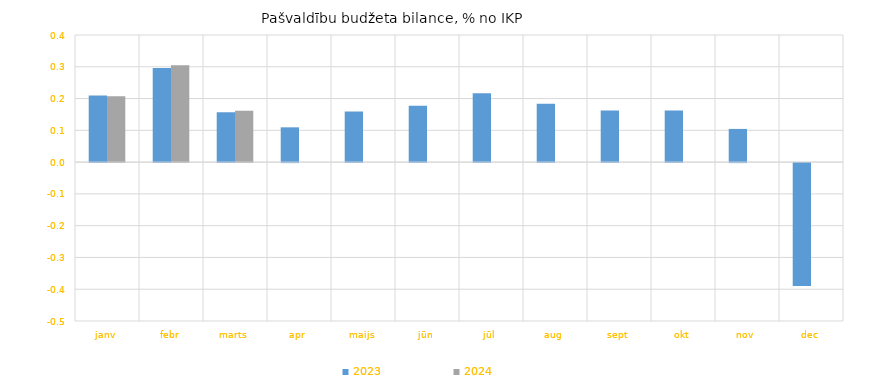
| Category | 2023 | 2024 |
|---|---|---|
| janv | 0.209 | 0.207 |
| febr | 0.296 | 0.305 |
| marts | 0.157 | 0.162 |
| apr | 0.109 | 0 |
| maijs | 0.159 | 0 |
| jūn | 0.177 | 0 |
| jūl | 0.217 | 0 |
| aug | 0.184 | 0 |
| sept | 0.162 | 0 |
| okt | 0.163 | 0 |
| nov | 0.104 | 0 |
| dec | -0.387 | 0 |